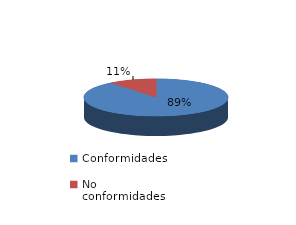
| Category | Series 0 |
|---|---|
| Conformidades | 2118 |
| No conformidades | 254 |